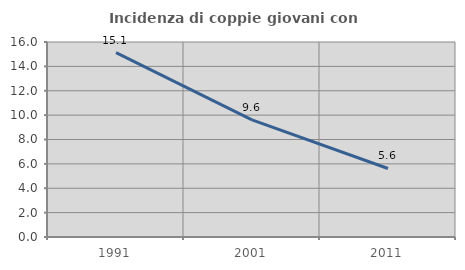
| Category | Incidenza di coppie giovani con figli |
|---|---|
| 1991.0 | 15.121 |
| 2001.0 | 9.608 |
| 2011.0 | 5.622 |